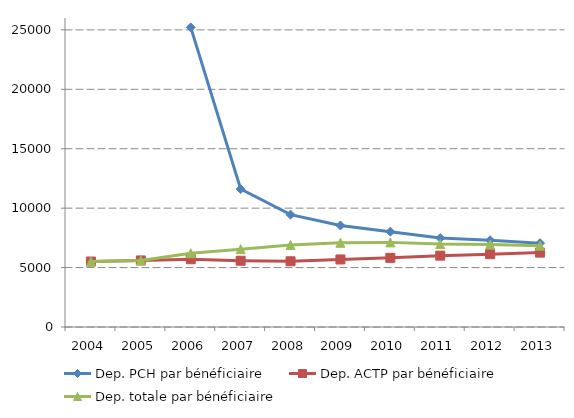
| Category | Dep. PCH par bénéficiaire | Dep. ACTP par bénéficiaire | Dep. totale par bénéficiaire |
|---|---|---|---|
| 2004.0 | 0 | 5508.011 | 5508.011 |
| 2005.0 | 0 | 5601.022 | 5601.022 |
| 2006.0 | 25209.208 | 5701.656 | 6211.004 |
| 2007.0 | 11609.057 | 5575.452 | 6547.866 |
| 2008.0 | 9449.367 | 5528.98 | 6894.159 |
| 2009.0 | 8541.53 | 5683.499 | 7085.837 |
| 2010.0 | 8021.458 | 5819.565 | 7120.492 |
| 2011.0 | 7486.791 | 6005.372 | 6978.601 |
| 2012.0 | 7298.946 | 6124.691 | 6947.858 |
| 2013.0 | 7056.461 | 6259.742 | 6846.063 |